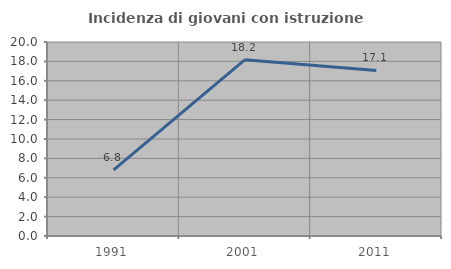
| Category | Incidenza di giovani con istruzione universitaria |
|---|---|
| 1991.0 | 6.818 |
| 2001.0 | 18.182 |
| 2011.0 | 17.073 |